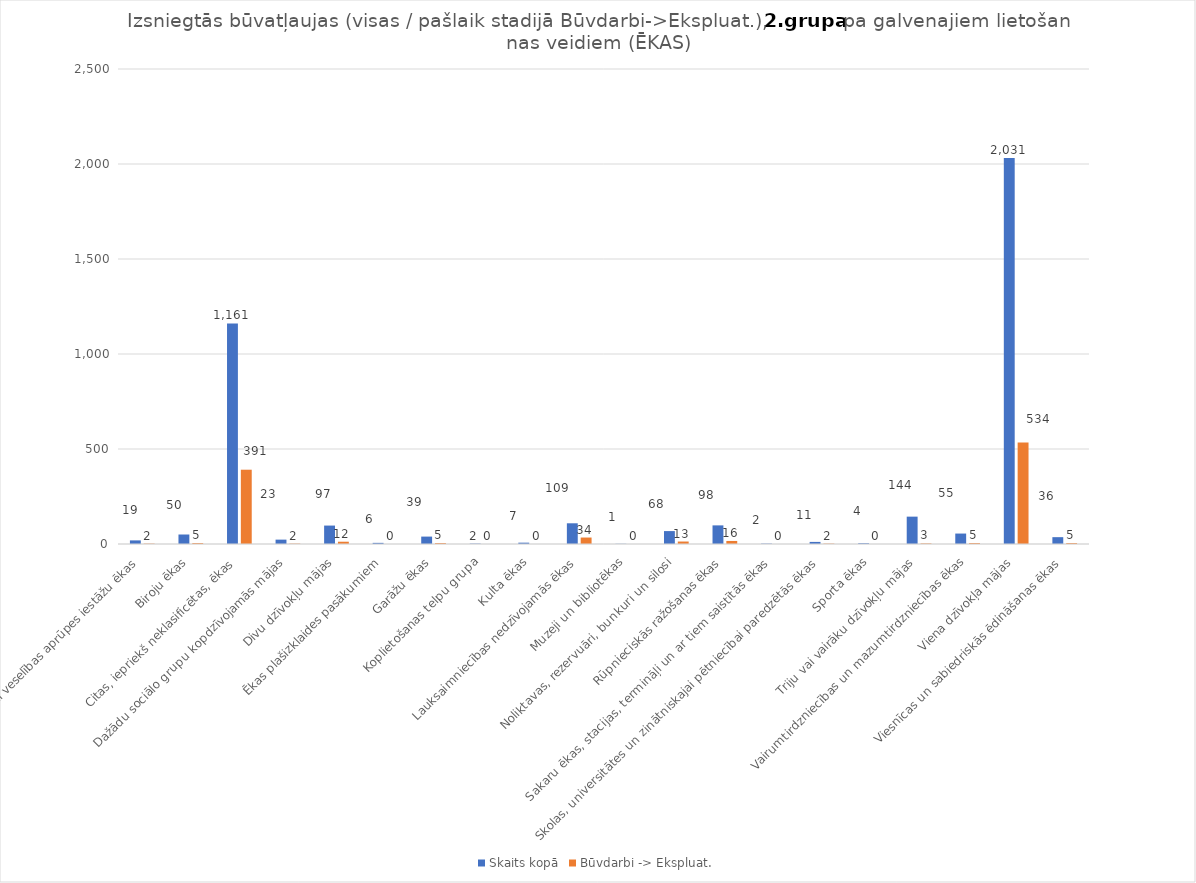
| Category | Skaits kopā | Būvdarbi -> Ekspluat. |
|---|---|---|
| Ārstniecības vai veselības aprūpes iestāžu ēkas | 19 | 2 |
| Biroju ēkas | 50 | 5 |
| Citas, iepriekš neklasificētas, ēkas | 1161 | 391 |
| Dažādu sociālo grupu kopdzīvojamās mājas | 23 | 2 |
| Divu dzīvokļu mājas | 97 | 12 |
| Ēkas plašizklaides pasākumiem | 6 | 0 |
| Garāžu ēkas | 39 | 5 |
| Koplietošanas telpu grupa | 2 | 0 |
| Kulta ēkas | 7 | 0 |
| Lauksaimniecības nedzīvojamās ēkas | 109 | 34 |
| Muzeji un bibliotēkas | 1 | 0 |
| Noliktavas, rezervuāri, bunkuri un silosi | 68 | 13 |
| Rūpnieciskās ražošanas ēkas | 98 | 16 |
| Sakaru ēkas, stacijas, termināļi un ar tiem saistītās ēkas | 2 | 0 |
| Skolas, universitātes un zinātniskajai pētniecībai paredzētās ēkas | 11 | 2 |
| Sporta ēkas | 4 | 0 |
| Triju vai vairāku dzīvokļu mājas | 144 | 3 |
| Vairumtirdzniecības un mazumtirdzniecības ēkas | 55 | 5 |
| Viena dzīvokļa mājas | 2031 | 534 |
| Viesnīcas un sabiedriskās ēdināšanas ēkas | 36 | 5 |